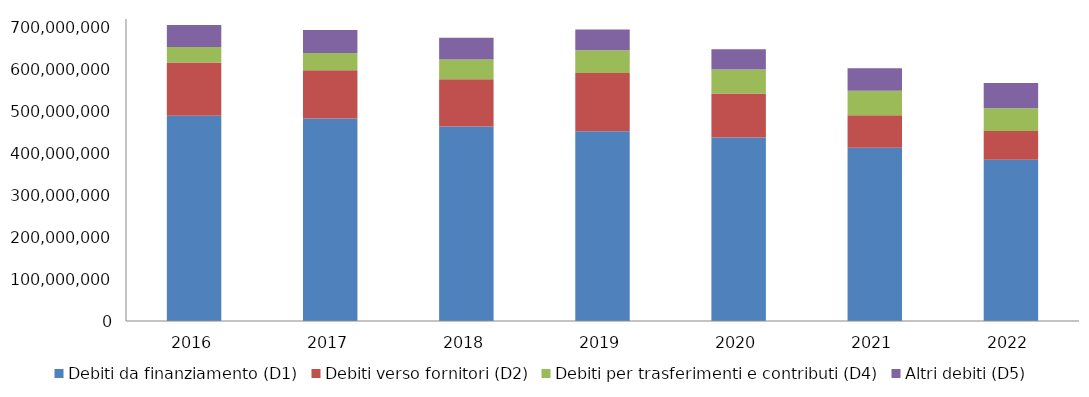
| Category | Debiti da finanziamento (D1) | Debiti verso fornitori (D2) | Debiti per trasferimenti e contributi (D4) | Altri debiti (D5) |
|---|---|---|---|---|
| 2016.0 | 489594911.83 | 126904379.82 | 36712215.26 | 52553926.47 |
| 2017.0 | 482619732.16 | 115213541.56 | 41296450.02 | 54686823.72 |
| 2018.0 | 463541167.55 | 112610250.77 | 47442340.76 | 51649070.59 |
| 2019.0 | 452485688.4 | 139009242.44 | 53877802.07 | 49712570.71 |
| 2020.0 | 437232772.9 | 105134562.61 | 57277530.23 | 48444830.94 |
| 2021.0 | 412809887.14 | 78012597.81 | 58296288.15 | 53481744.57 |
| 2022.0 | 384518313 | 68327745.21 | 54607357.7 | 60122992.19 |